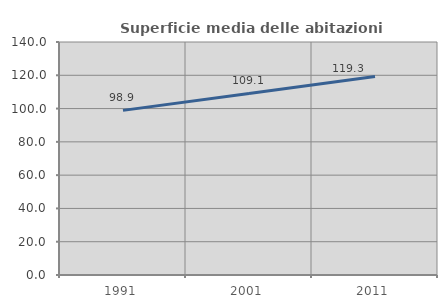
| Category | Superficie media delle abitazioni occupate |
|---|---|
| 1991.0 | 98.917 |
| 2001.0 | 109.06 |
| 2011.0 | 119.328 |